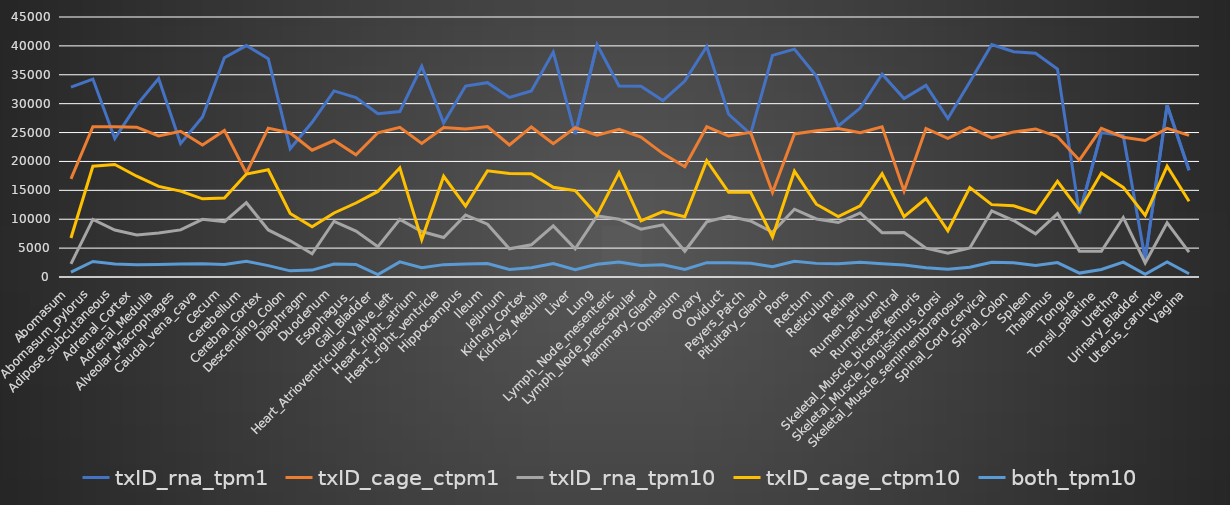
| Category | txID_rna_tpm1 | txID_cage_ctpm1 | txID_rna_tpm10 | txID_cage_ctpm10 | both_tpm10 |
|---|---|---|---|---|---|
| Abomasum | 32872 | 16981 | 2271 | 6752 | 847 |
| Abomasum_pylorus | 34255 | 26017 | 9971 | 19177 | 2695 |
| Adipose_subcutaneous | 23980 | 26012 | 8136 | 19481 | 2232 |
| Adrenal_Cortex | 29748 | 25935 | 7282 | 17441 | 2111 |
| Adrenal_Medulla | 34331 | 24423 | 7622 | 15677 | 2174 |
| Alveolar_Macrophages | 23092 | 25219 | 8155 | 14871 | 2244 |
| Caudal_vena_cava | 27703 | 22852 | 9983 | 13525 | 2299 |
| Cecum | 37945 | 25367 | 9579 | 13679 | 2169 |
| Cerebellum | 40052 | 17966 | 12853 | 17808 | 2737 |
| Cerebral_Cortex | 37775 | 25766 | 8146 | 18552 | 1964 |
| Descending_Colon | 22215 | 24926 | 6265 | 10985 | 1066 |
| Diaphragm | 26785 | 21940 | 4030 | 8689 | 1198 |
| Duodenum | 32211 | 23624 | 9643 | 11081 | 2251 |
| Esophagus_ | 31054 | 21157 | 7950 | 12804 | 2181 |
| Gall_Bladder | 28244 | 24966 | 5228 | 14809 | 417 |
| Heart_Atrioventricular_Valve_left | 28638 | 25894 | 9964 | 18898 | 2621 |
| Heart_right_atrium | 36474 | 23110 | 7869 | 6474 | 1604 |
| Heart_right_ventricle | 26636 | 25862 | 6829 | 17434 | 2140 |
| Hippocampus | 33055 | 25608 | 10741 | 12270 | 2261 |
| Ileum | 33638 | 26046 | 9148 | 18383 | 2317 |
| Jejunum | 31081 | 22852 | 4886 | 17917 | 1315 |
| Kidney_Cortex | 32184 | 25971 | 5568 | 17878 | 1593 |
| Kidney_Medulla | 38921 | 23063 | 8850 | 15534 | 2342 |
| Liver | 24735 | 25829 | 4877 | 14958 | 1251 |
| Lung | 40208 | 24550 | 10564 | 10704 | 2213 |
| Lymph_Node_mesenteric | 33050 | 25564 | 10010 | 18070 | 2598 |
| Lymph_Node_prescapular | 33003 | 24209 | 8285 | 9725 | 2002 |
| Mammary_Gland | 30537 | 21362 | 9019 | 11309 | 2109 |
| Omasum | 33912 | 19094 | 4461 | 10416 | 1291 |
| Ovary | 39883 | 26018 | 9536 | 20147 | 2487 |
| Oviduct | 28163 | 24400 | 10511 | 14662 | 2482 |
| Peyers_Patch | 24736 | 25032 | 9689 | 14671 | 2368 |
| Pituitary_Gland | 38357 | 14638 | 7750 | 6919 | 1776 |
| Pons | 39442 | 24754 | 11738 | 18316 | 2724 |
| Rectum | 34774 | 25318 | 10050 | 12600 | 2358 |
| Reticulum | 26132 | 25687 | 9424 | 10472 | 2298 |
| Retina | 29240 | 24955 | 11083 | 12328 | 2543 |
| Rumen_atrium | 35092 | 25991 | 7679 | 17879 | 2286 |
| Rumen_ventral | 30888 | 14880 | 7700 | 10426 | 2077 |
| Skeletal_Muscle_biceps_femoris | 33167 | 25705 | 4991 | 13582 | 1598 |
| Skeletal_Muscle_longissimus_dorsi | 27435 | 23995 | 4110 | 8005 | 1322 |
| Skeletal_Muscle_semimembranosus | 33758 | 25881 | 5027 | 15491 | 1702 |
| Spinal_Cord_cervical | 40222 | 24066 | 11454 | 12525 | 2547 |
| Spiral_Colon | 38994 | 25115 | 9776 | 12313 | 2447 |
| Spleen | 38738 | 25626 | 7468 | 11069 | 1990 |
| Thalamus | 35981 | 24288 | 10974 | 16571 | 2497 |
| Tongue | 10926 | 20220 | 4439 | 11526 | 675 |
| Tonsil_palatine | 25001 | 25732 | 4463 | 17983 | 1300 |
| Urethra | 24462 | 24199 | 10304 | 15511 | 2573 |
| Urinary_Bladder | 3050 | 23623 | 2419 | 10658 | 461 |
| Uterus_caruncle | 29731 | 25718 | 9390 | 19178 | 2600 |
| Vagina | 18460 | 24505 | 4297 | 13122 | 570 |